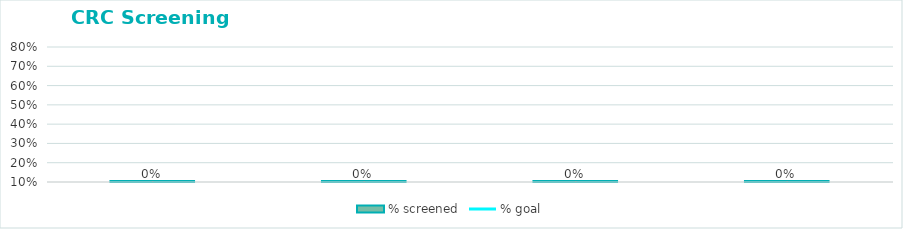
| Category | % screened |
|---|---|
|  | 0 |
|  | 0 |
|  | 0 |
|  | 0 |